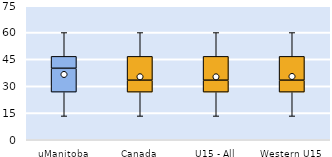
| Category | 25th | 50th | 75th |
|---|---|---|---|
| uManitoba | 26.667 | 13.333 | 6.667 |
| Canada | 26.667 | 6.667 | 13.333 |
| U15 - All | 26.667 | 6.667 | 13.333 |
| Western U15 | 26.667 | 6.667 | 13.333 |